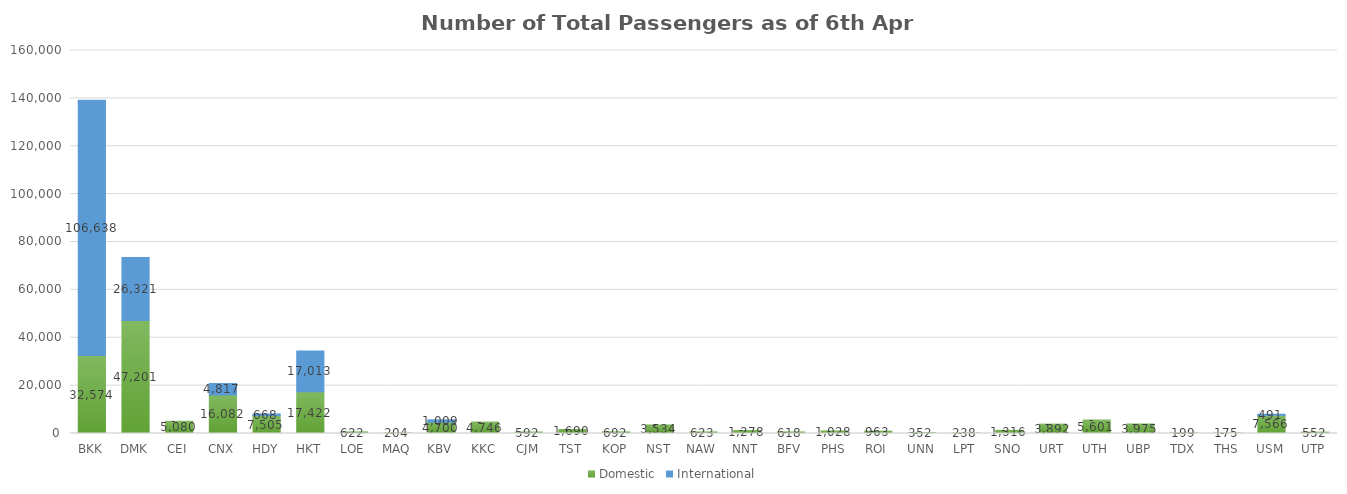
| Category | Domestic | International |
|---|---|---|
| BKK | 32574 | 106638 |
| DMK | 47201 | 26321 |
| CEI | 5080 | 0 |
| CNX | 16082 | 4817 |
| HDY | 7505 | 668 |
| HKT | 17422 | 17013 |
| LOE | 622 | 0 |
| MAQ | 204 | 0 |
| KBV | 4700 | 1009 |
| KKC | 4746 | 0 |
| CJM | 592 | 0 |
| TST | 1690 | 0 |
| KOP | 692 | 0 |
| NST | 3534 | 0 |
| NAW | 623 | 0 |
| NNT | 1278 | 0 |
| BFV | 618 | 0 |
| PHS | 1028 | 0 |
| ROI | 963 | 0 |
| UNN | 352 | 0 |
| LPT | 238 | 0 |
| SNO | 1316 | 0 |
| URT | 3892 | 0 |
| UTH | 5601 | 0 |
| UBP | 3975 | 0 |
| TDX | 199 | 0 |
| THS | 175 | 0 |
| USM | 7566 | 491 |
| UTP | 552 | 0 |